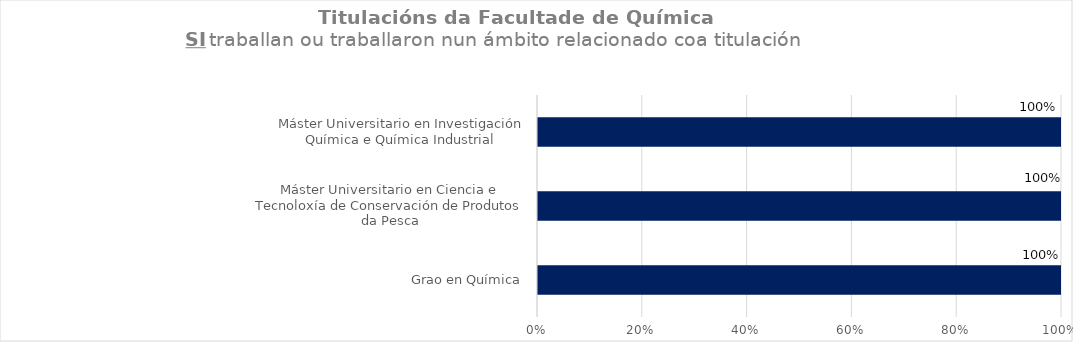
| Category | Series 1 |
|---|---|
| Grao en Química | 1 |
| Máster Universitario en Ciencia e Tecnoloxía de Conservación de Produtos da Pesca | 1 |
| Máster Universitario en Investigación Química e Química Industrial | 1 |